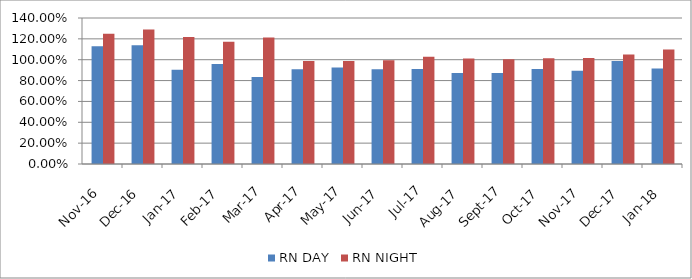
| Category | RN DAY | RN NIGHT |
|---|---|---|
| 2016-11-01 | 1.13 | 1.248 |
| 2016-12-01 | 1.139 | 1.29 |
| 2017-01-01 | 0.905 | 1.218 |
| 2017-02-01 | 0.96 | 1.173 |
| 2017-03-01 | 0.834 | 1.214 |
| 2017-04-01 | 0.909 | 0.986 |
| 2017-05-01 | 0.926 | 0.987 |
| 2017-06-01 | 0.908 | 0.994 |
| 2017-07-01 | 0.91 | 1.029 |
| 2017-08-01 | 0.872 | 1.011 |
| 2017-09-01 | 0.872 | 1.005 |
| 2017-10-01 | 0.912 | 1.013 |
| 2017-11-01 | 0.895 | 1.015 |
| 2017-12-01 | 0.987 | 1.05 |
| 2018-01-01 | 0.916 | 1.099 |